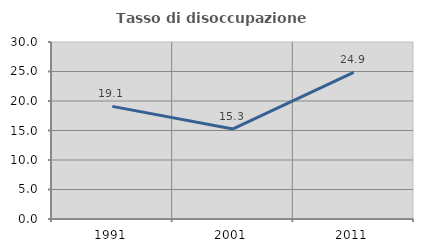
| Category | Tasso di disoccupazione giovanile  |
|---|---|
| 1991.0 | 19.093 |
| 2001.0 | 15.267 |
| 2011.0 | 24.852 |